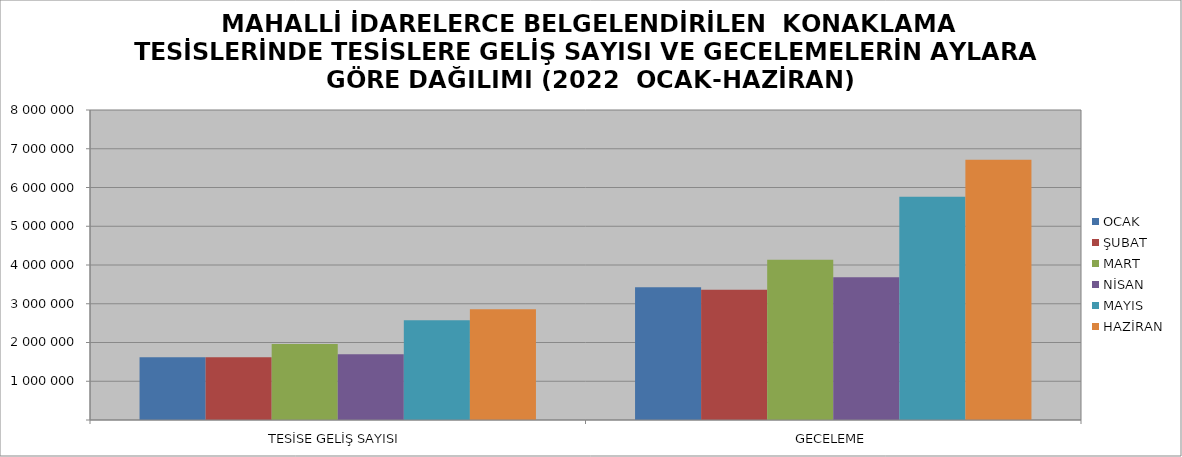
| Category | OCAK | ŞUBAT | MART | NİSAN | MAYIS | HAZİRAN |
|---|---|---|---|---|---|---|
| TESİSE GELİŞ SAYISI | 1617436 | 1619305 | 1960867 | 1699422 | 2574819 | 2859746 |
| GECELEME | 3427709 | 3362025 | 4136510 | 3684991 | 5758959 | 6716122 |